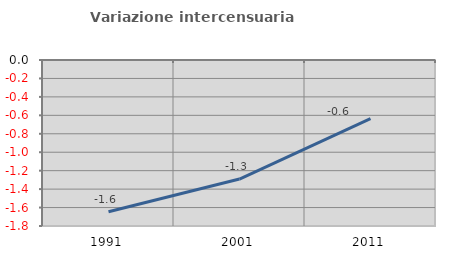
| Category | Variazione intercensuaria annua |
|---|---|
| 1991.0 | -1.645 |
| 2001.0 | -1.291 |
| 2011.0 | -0.635 |